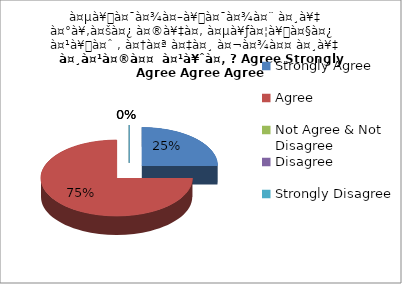
| Category | à¤µà¥à¤¯à¤¾à¤–à¥à¤¯à¤¾à¤¨ à¤¸à¥‡ à¤°à¥‚à¤šà¤¿ à¤®à¥‡à¤‚ à¤µà¥ƒà¤¦à¥à¤§à¤¿ à¤¹à¥à¤ˆ , à¤†à¤ª à¤‡à¤¸ à¤¬à¤¾à¤¤ à¤¸à¥‡ à¤¸à¤¹à¤®à¤¤  à¤¹à¥ˆà¤‚ ? Agree Strongly Agree Agree Agree |
|---|---|
| Strongly Agree | 1 |
| Agree | 3 |
| Not Agree & Not Disagree | 0 |
| Disagree | 0 |
| Strongly Disagree | 0 |